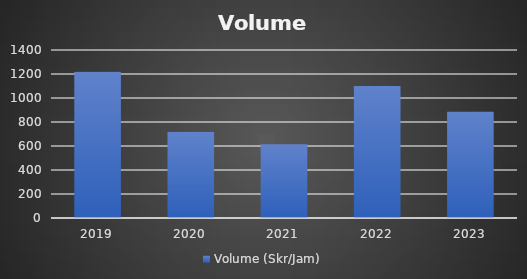
| Category | Volume (Skr/Jam) |
|---|---|
| 2019.0 | 1217.745 |
| 2020.0 | 718.821 |
| 2021.0 | 614.906 |
| 2022.0 | 1099.11 |
| 2023.0 | 887.438 |